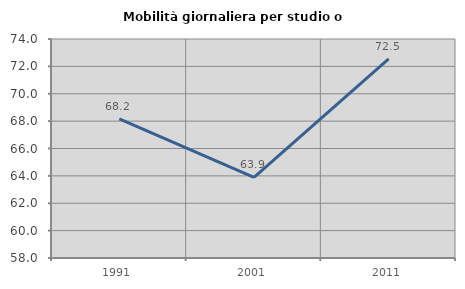
| Category | Mobilità giornaliera per studio o lavoro |
|---|---|
| 1991.0 | 68.165 |
| 2001.0 | 63.892 |
| 2011.0 | 72.543 |